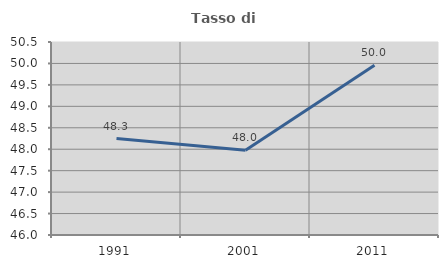
| Category | Tasso di occupazione   |
|---|---|
| 1991.0 | 48.25 |
| 2001.0 | 47.975 |
| 2011.0 | 49.961 |